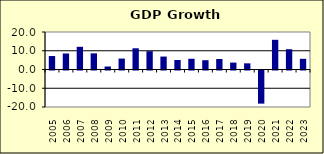
| Category | 4.2 |
|---|---|
| 2005.0 | 7.183 |
| 2006.0 | 8.537 |
| 2007.0 | 12.111 |
| 2008.0 | 8.612 |
| 2009.0 | 1.598 |
| 2010.0 | 5.828 |
| 2011.0 | 11.314 |
| 2012.0 | 9.779 |
| 2013.0 | 6.903 |
| 2014.0 | 5.067 |
| 2015.0 | 5.733 |
| 2016.0 | 4.953 |
| 2017.0 | 5.591 |
| 2018.0 | 3.685 |
| 2019.0 | 3.282 |
| 2020.0 | -17.668 |
| 2021.0 | 15.836 |
| 2022.0 | 10.809 |
| 2023.0 | 5.7 |